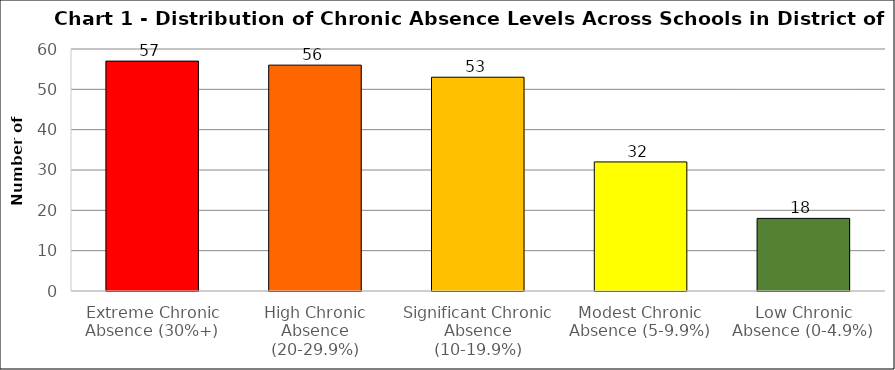
| Category | Series 0 |
|---|---|
| Extreme Chronic Absence (30%+) | 57 |
| High Chronic Absence (20-29.9%) | 56 |
| Significant Chronic Absence (10-19.9%) | 53 |
| Modest Chronic Absence (5-9.9%) | 32 |
| Low Chronic Absence (0-4.9%) | 18 |